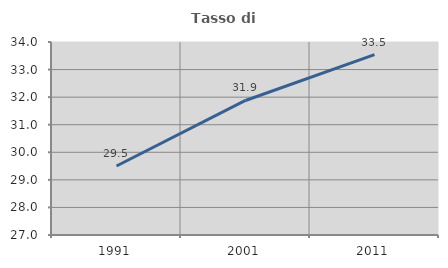
| Category | Tasso di occupazione   |
|---|---|
| 1991.0 | 29.504 |
| 2001.0 | 31.88 |
| 2011.0 | 33.539 |